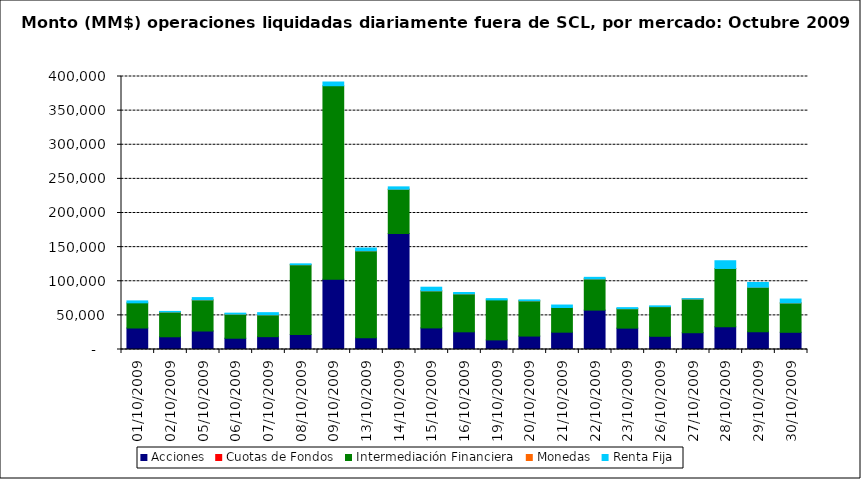
| Category | Acciones | Cuotas de Fondos | Intermediación Financiera | Monedas | Renta Fija |
|---|---|---|---|---|---|
| 01/10/2009 | 31487.133 | 0 | 36870.074 | 0 | 2856.534 |
| 02/10/2009 | 18645.495 | 0 | 36238.4 | 0.185 | 914.479 |
| 05/10/2009 | 27083.506 | 0 | 45656.085 | 0.348 | 3316.607 |
| 06/10/2009 | 16518.134 | 0 | 35278.464 | 5.95 | 1465.547 |
| 07/10/2009 | 18818.441 | 0 | 31957.51 | 4.48 | 3201.626 |
| 08/10/2009 | 21855.638 | 0 | 102331.86 | 0.605 | 1324.764 |
| 09/10/2009 | 102776.984 | 0 | 283681.941 | 0 | 5470.252 |
| 13/10/2009 | 17225.152 | 0 | 127350.743 | 0.704 | 4096.565 |
| 14/10/2009 | 170144.967 | 0 | 64680.669 | 3.47 | 3469.756 |
| 15/10/2009 | 31614.678 | 0 | 54311.375 | 0.694 | 5338.053 |
| 16/10/2009 | 25897.46 | 0 | 55603.242 | 2.72 | 2005.954 |
| 19/10/2009 | 14074.5 | 0 | 58568.228 | 0 | 1877.063 |
| 20/10/2009 | 19689.746 | 0 | 51598.226 | 1.71 | 1398.19 |
| 21/10/2009 | 25375.419 | 0 | 36147.156 | 5.497 | 3629.073 |
| 22/10/2009 | 57713.563 | 0 | 45652.388 | 1.71 | 2364.73 |
| 23/10/2009 | 31295.173 | 0 | 28446.38 | 28.044 | 1549.455 |
| 26/10/2009 | 19353.61 | 0 | 43471.753 | 5.13 | 1107.15 |
| 27/10/2009 | 24571.04 | 0 | 49403.169 | 18.81 | 519.772 |
| 28/10/2009 | 33227.566 | 0 | 85502.405 | 7.182 | 11310.212 |
| 29/10/2009 | 26047.67 | 0 | 65194.532 | 12.35 | 6967.558 |
| 30/10/2009 | 25200.148 | 0 | 42998.488 | 11.55 | 5744.094 |